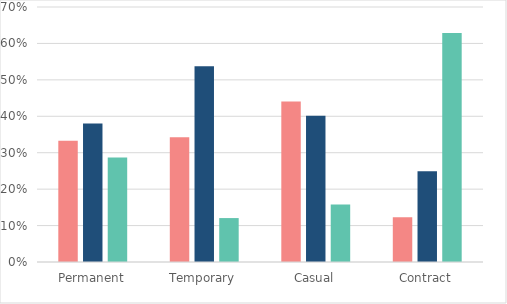
| Category | Education sector | Health sector | Rest of sector |
|---|---|---|---|
| Permanent | 0.333 | 0.38 | 0.287 |
| Temporary | 0.342 | 0.537 | 0.121 |
| Casual | 0.441 | 0.402 | 0.158 |
| Contract | 0.123 | 0.249 | 0.628 |